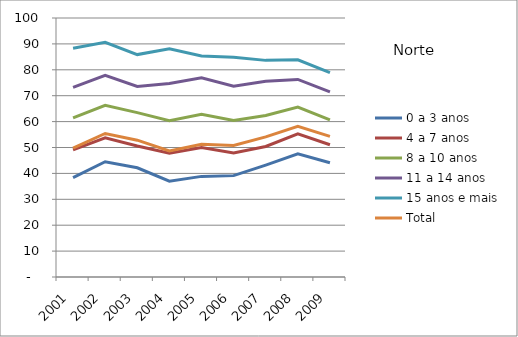
| Category | 0 a 3 anos | 4 a 7 anos | 8 a 10 anos | 11 a 14 anos | 15 anos e mais | Total |
|---|---|---|---|---|---|---|
| 2001.0 | 38.4 | 49.06 | 61.4 | 73.2 | 88.32 | 49.75 |
| 2002.0 | 44.51 | 53.74 | 66.32 | 77.84 | 90.62 | 55.41 |
| 2003.0 | 42.16 | 50.56 | 63.47 | 73.56 | 85.87 | 52.83 |
| 2004.0 | 37.02 | 47.77 | 60.37 | 74.68 | 88.16 | 48.67 |
| 2005.0 | 38.85 | 49.99 | 62.87 | 76.89 | 85.37 | 51.28 |
| 2006.0 | 39.14 | 47.91 | 60.39 | 73.65 | 84.84 | 50.77 |
| 2007.0 | 43.19 | 50.4 | 62.33 | 75.55 | 83.64 | 54.11 |
| 2008.0 | 47.52 | 55.24 | 65.64 | 76.27 | 83.88 | 58.17 |
| 2009.0 | 44.13 | 51.05 | 60.68 | 71.47 | 78.87 | 54.32 |